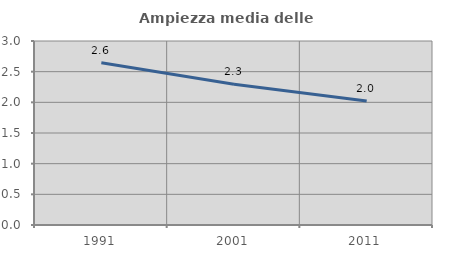
| Category | Ampiezza media delle famiglie |
|---|---|
| 1991.0 | 2.644 |
| 2001.0 | 2.295 |
| 2011.0 | 2.02 |